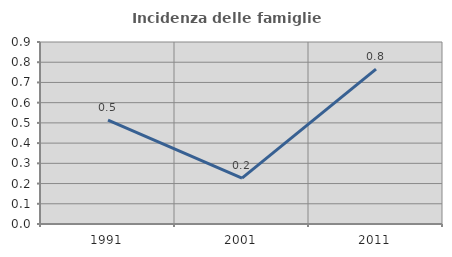
| Category | Incidenza delle famiglie numerose |
|---|---|
| 1991.0 | 0.514 |
| 2001.0 | 0.227 |
| 2011.0 | 0.766 |